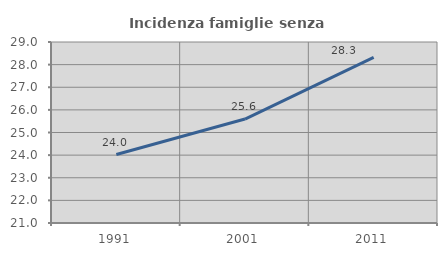
| Category | Incidenza famiglie senza nuclei |
|---|---|
| 1991.0 | 24.025 |
| 2001.0 | 25.595 |
| 2011.0 | 28.322 |